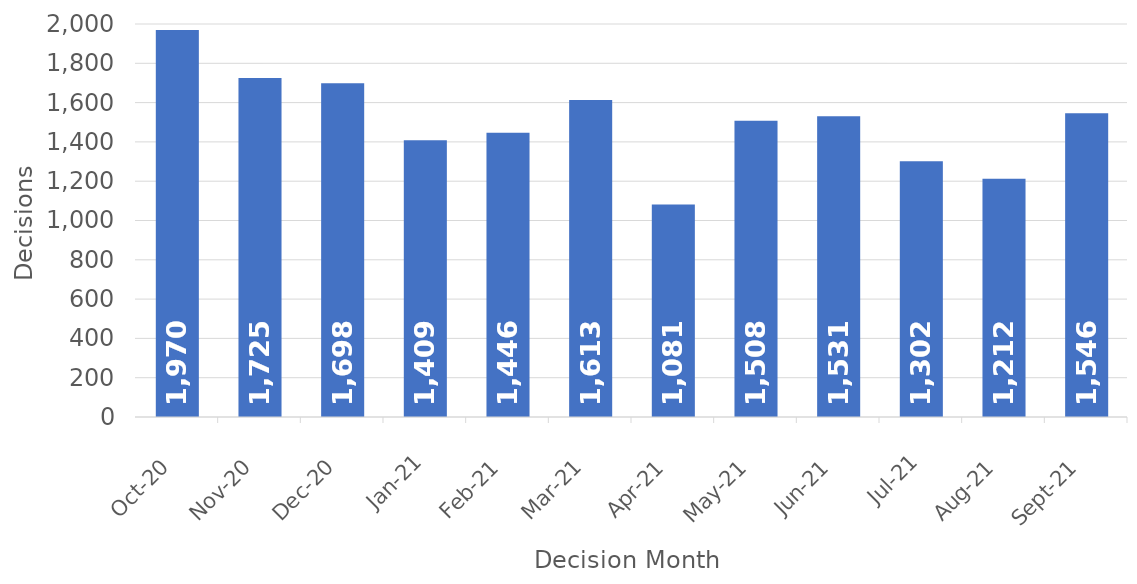
| Category | Decisions |
|---|---|
| 2020-10-01 | 1970 |
| 2020-11-01 | 1725 |
| 2020-12-01 | 1698 |
| 2021-01-01 | 1409 |
| 2021-02-01 | 1446 |
| 2021-03-01 | 1613 |
| 2021-04-01 | 1081 |
| 2021-05-01 | 1508 |
| 2021-06-01 | 1531 |
| 2021-07-01 | 1302 |
| 2021-08-01 | 1212 |
| 2021-09-01 | 1546 |